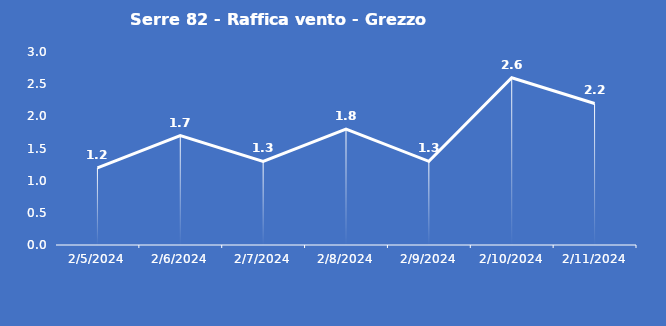
| Category | Serre 82 - Raffica vento - Grezzo (m/s) |
|---|---|
| 2/5/24 | 1.2 |
| 2/6/24 | 1.7 |
| 2/7/24 | 1.3 |
| 2/8/24 | 1.8 |
| 2/9/24 | 1.3 |
| 2/10/24 | 2.6 |
| 2/11/24 | 2.2 |